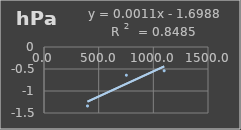
| Category | Presión Atmosférica |
|---|---|
| 397.9 | -1.34 |
| 753.2 | -0.641 |
| 1099.2 | -0.54 |